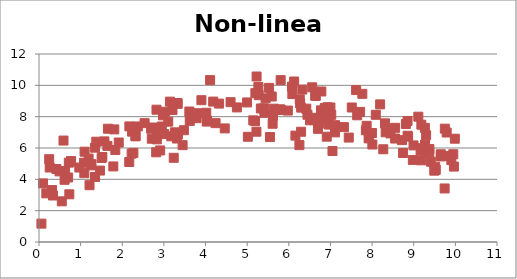
| Category | Y |
|---|---|
| 1.504428879239742 | 5.36 |
| 3.828993370049959 | 8.22 |
| 6.607733289165144 | 7.783 |
| 7.9164196835975575 | 6.613 |
| 9.90313537233408 | 5.227 |
| 6.509404807983094 | 7.769 |
| 0.9679102030733844 | 4.753 |
| 1.0883641838783564 | 4.396 |
| 8.326665325314046 | 7.005 |
| 1.7850824158409495 | 4.824 |
| 7.323220331276747 | 7.334 |
| 5.809117522244078 | 8.428 |
| 5.402259068109407 | 8.533 |
| 5.7914001771567305 | 8.47 |
| 6.633158906692103 | 9.342 |
| 0.41760338472536573 | 4.659 |
| 6.699390634521297 | 7.225 |
| 1.376290303985227 | 6.401 |
| 7.92895384023745 | 6.697 |
| 8.19299535469236 | 8.784 |
| 8.811771406870372 | 7.532 |
| 3.177966143004056 | 6.744 |
| 9.987274159666436 | 6.593 |
| 1.247839947618492 | 4.892 |
| 2.692380712035095 | 7.23 |
| 9.52917985179409 | 4.607 |
| 9.373481974535983 | 5.707 |
| 5.225957750867604 | 10.563 |
| 1.342493303342479 | 6.021 |
| 7.99693523030215 | 6.954 |
| 5.611022992252291 | 7.547 |
| 2.979812258301473 | 8.085 |
| 2.8219907979334415 | 8.445 |
| 7.85081134960727 | 7.132 |
| 6.9580499628730905 | 7.495 |
| 5.525677129217882 | 9.839 |
| 6.272236166080864 | 8.84 |
| 1.5713524896293007 | 6.421 |
| 6.263421898456683 | 9.102 |
| 3.611473537195212 | 8.329 |
| 4.017606016444089 | 8.25 |
| 5.442844710533877 | 9.171 |
| 6.927226229209613 | 8.598 |
| 3.312417321798309 | 6.605 |
| 6.076619482999622 | 9.922 |
| 6.856124944284757 | 8.018 |
| 4.037122212513012 | 7.744 |
| 2.535886294793799 | 7.587 |
| 2.166963884046921 | 5.107 |
| 4.109476685606422 | 10.334 |
| 9.267533814916394 | 7.283 |
| 7.019069811262316 | 8.118 |
| 7.641914957885577 | 8.087 |
| 2.82994527988743 | 6.552 |
| 8.718354802434288 | 6.503 |
| 5.146369191176385 | 7.765 |
| 3.264644974561172 | 7.001 |
| 6.999296960394777 | 8.587 |
| 7.04855077558288 | 5.807 |
| 8.852929761074357 | 6.782 |
| 2.2668045087437436 | 5.687 |
| 9.110855290726752 | 7.999 |
| 3.620771914457034 | 7.728 |
| 9.49293760958332 | 4.553 |
| 9.183235728227395 | 7.486 |
| 1.6553327298022502 | 7.23 |
| 5.804209698521131 | 10.332 |
| 7.108228079482567 | 6.996 |
| 3.144438595623078 | 8.96 |
| 4.183503453075579 | 8.963 |
| 6.1584528377841945 | 6.79 |
| 9.272532626294062 | 6.221 |
| 6.647188905345028 | 9.33 |
| 2.7323739877918216 | 7.307 |
| 4.7530995721542855 | 8.59 |
| 5.222509972750098 | 7.04 |
| 8.551265901780829 | 7.289 |
| 9.650134607996119 | 5.6 |
| 4.600641795253293 | 8.927 |
| 6.324162143186958 | 9.73 |
| 2.235525935662781 | 7.044 |
| 0.05853877658295925 | 1.172 |
| 3.0292277672133494 | 8.314 |
| 4.996406509629124 | 8.908 |
| 2.8140300745021585 | 5.724 |
| 3.9013352260472245 | 9.051 |
| 7.616052054688332 | 9.697 |
| 6.447684806601456 | 8.121 |
| 5.017015450844255 | 6.716 |
| 0.7165964117513401 | 5.065 |
| 0.6994794645747693 | 4.116 |
| 3.10387223397628 | 7.68 |
| 0.6268768461318197 | 4.533 |
| 9.411680532772825 | 5.124 |
| 8.310373445756133 | 7.573 |
| 9.864161034569074 | 5.488 |
| 8.995276428384658 | 6.165 |
| 9.949606722768138 | 5.603 |
| 8.979031254717123 | 5.238 |
| 3.328919546366307 | 8.817 |
| 3.337544615002679 | 6.866 |
| 1.0947179557385323 | 5.763 |
| 8.865051822830276 | 6.723 |
| 1.8084907004049955 | 7.187 |
| 5.641054810828846 | 8.509 |
| 1.345234114751238 | 4.152 |
| 3.236254164107424 | 5.374 |
| 6.876771609864734 | 7.824 |
| 2.949939103280511 | 7.372 |
| 0.7704880391207836 | 5.14 |
| 5.276911006806247 | 9.37 |
| 0.33715398125124363 | 2.967 |
| 9.29746636494466 | 6.818 |
| 8.553018968331987 | 6.604 |
| 0.2444490310593428 | 5.285 |
| 8.44136581761925 | 6.932 |
| 7.765634242471546 | 9.457 |
| 9.259366757101727 | 5.668 |
| 2.372722297735649 | 7.375 |
| 5.414384763309675 | 8.244 |
| 5.619646776041569 | 8.062 |
| 3.479754950616736 | 7.135 |
| 6.963954406083664 | 7.753 |
| 2.8272200222414847 | 6.767 |
| 9.966038431778546 | 4.815 |
| 8.006332424093353 | 6.223 |
| 6.629831181155277 | 7.928 |
| 1.833459493203149 | 5.874 |
| 2.1708360864821774 | 7.378 |
| 9.66025245143193 | 5.474 |
| 2.225525508321758 | 5.64 |
| 4.461599977937639 | 7.25 |
| 1.5208423311296493 | 5.426 |
| 9.176632718541999 | 5.213 |
| 0.5885653027851401 | 6.475 |
| 1.4641308875693249 | 4.559 |
| 6.084370574931103 | 9.443 |
| 0.7282183988618451 | 3.045 |
| 7.110040517986026 | 7.456 |
| 1.260833705680019 | 4.97 |
| 4.325223629770301 | 8.834 |
| 6.294608039187767 | 7.037 |
| 0.31413418693613915 | 3.317 |
| 0.09600081076787892 | 3.74 |
| 9.515934458169648 | 4.802 |
| 1.081949489441767 | 5.058 |
| 7.712473371832549 | 8.306 |
| 6.56157224530228 | 9.874 |
| 6.910901535914263 | 6.722 |
| 6.419259279582369 | 8.509 |
| 9.197867652286657 | 5.987 |
| 6.29662458016506 | 8.577 |
| 5.189111903931373 | 7.713 |
| 8.088915759799972 | 8.119 |
| 1.2135672620020133 | 3.625 |
| 6.7718787208584965 | 8.402 |
| 7.5118857611185685 | 8.586 |
| 5.976362556693651 | 8.39 |
| 6.723710005476824 | 7.561 |
| 0.17562582943799976 | 3.104 |
| 4.028826098788215 | 7.687 |
| 8.85152917553582 | 7.726 |
| 5.5466190043184005 | 6.698 |
| 6.253977696794201 | 6.184 |
| 7.869347288596698 | 7.415 |
| 1.1911519340907262 | 5.326 |
| 2.709186254395944 | 6.592 |
| 8.744372794880853 | 5.682 |
| 3.326887111355501 | 8.872 |
| 0.7688631428038295 | 5.168 |
| 9.791236587645066 | 6.988 |
| 2.316504117399604 | 6.744 |
| 6.864692642181941 | 8.558 |
| 6.781280136558541 | 9.607 |
| 9.742247518479948 | 3.417 |
| 0.25666320215348093 | 4.755 |
| 5.329091656663271 | 8.523 |
| 4.240687346538506 | 7.585 |
| 3.784371278777292 | 7.903 |
| 9.376803999050185 | 5.93 |
| 0.6140753834956936 | 3.97 |
| 7.439657724606478 | 6.666 |
| 9.165295488695003 | 5.837 |
| 0.5477792612349364 | 2.597 |
| 1.9157426734178429 | 6.35 |
| 3.205939555872245 | 8.422 |
| 5.196923497924279 | 9.5 |
| 5.59013187976266 | 9.287 |
| 5.269433261107379 | 9.896 |
| 2.3198097379837126 | 6.77 |
| 6.128136601792469 | 10.245 |
| 0.4933517907413387 | 4.506 |
| 9.746993475013447 | 7.235 |
| 8.26854809772017 | 5.919 |
| 3.4490865656485648 | 6.181 |
| 3.0085295233760445 | 6.887 |
| 9.651931878801122 | 5.474 |
| 1.643352608777332 | 6.134 |
| 2.9107760675030327 | 5.844 |